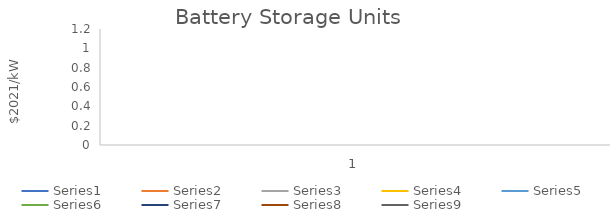
| Category | Series 0 | Series 1 | Series 2 | Series 3 | Series 4 | Series 5 | Series 6 | Series 7 | Series 8 |
|---|---|---|---|---|---|---|---|---|---|
| 0 | 1 | 1 | 1 | 1 | 1 | 1 | 1 | 1 | 1 |